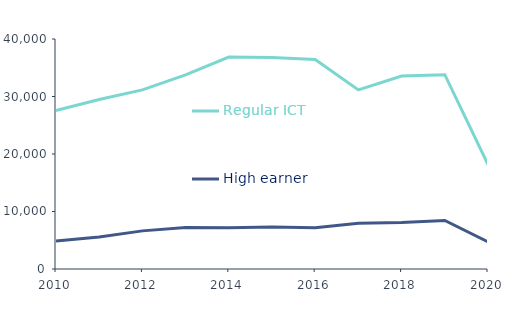
| Category | Regular ICT | High earner |
|---|---|---|
| 2010.0 | 27577 | 4857 |
| 2011.0 | 29491 | 5584 |
| 2012.0 | 31149 | 6630 |
| 2013.0 | 33774 | 7196 |
| 2014.0 | 36853 | 7172 |
| 2015.0 | 36778 | 7308 |
| 2016.0 | 36428 | 7170 |
| 2017.0 | 31141 | 7964 |
| 2018.0 | 33560 | 8077 |
| 2019.0 | 33789 | 8438 |
| 2020.0 | 18146 | 4718 |